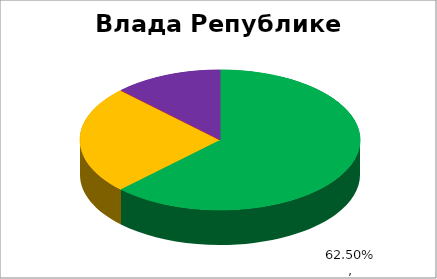
| Category | Влада Републике Србије |
|---|---|
| 0 | 0.625 |
| 1 | 0.25 |
| 2 | 0 |
| 3 | 0 |
| 4 | 0.125 |